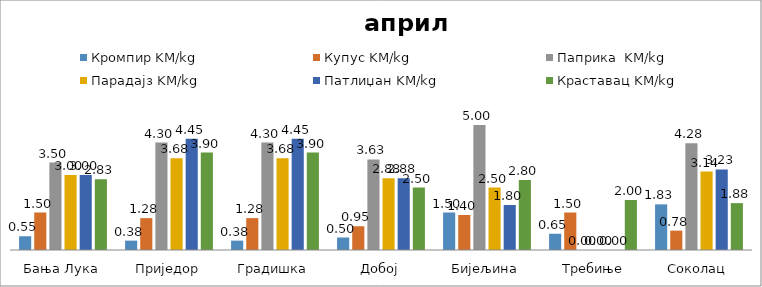
| Category | Кромпир KM/kg | Купус KM/kg | Паприка  KM/kg | Парадајз KM/kg | Патлиџан KM/kg | Краставац KM/kg |
|---|---|---|---|---|---|---|
| Бања Лука | 0.55 | 1.5 | 3.5 | 3 | 3 | 2.833 |
| Приједор | 0.375 | 1.275 | 4.3 | 3.675 | 4.45 | 3.9 |
| Градишка | 0.375 | 1.275 | 4.3 | 3.675 | 4.45 | 3.9 |
| Добој | 0.5 | 0.95 | 3.625 | 2.875 | 2.875 | 2.5 |
| Бијељина | 1.5 | 1.4 | 5 | 2.5 | 1.8 | 2.8 |
|  Требиње | 0.65 | 1.5 | 0 | 0 | 0 | 2 |
| Соколац | 1.825 | 0.775 | 4.275 | 3.138 | 3.225 | 1.875 |